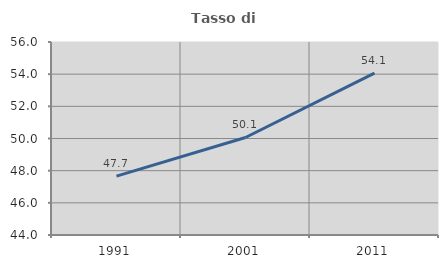
| Category | Tasso di occupazione   |
|---|---|
| 1991.0 | 47.659 |
| 2001.0 | 50.063 |
| 2011.0 | 54.062 |